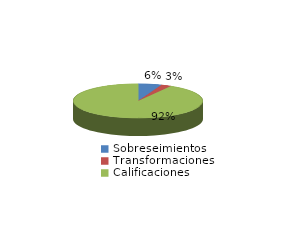
| Category | Series 0 |
|---|---|
| Sobreseimientos | 30 |
| Transformaciones | 13 |
| Calificaciones | 473 |